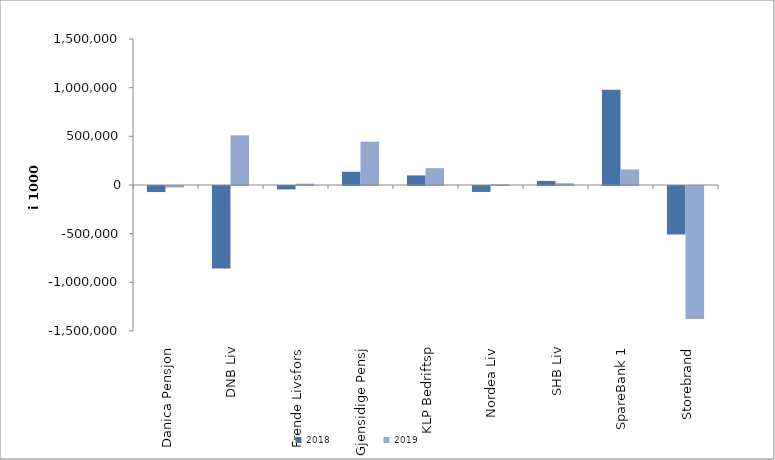
| Category | 2018 | 2019 |
|---|---|---|
| Danica Pensjon | -62184.461 | -16045.73 |
| DNB Liv | -846689 | 510695 |
| Frende Livsfors | -35262.409 | 13609.839 |
| Gjensidige Pensj | 136390 | 445335 |
| KLP Bedriftsp | 98497 | 173001 |
| Nordea Liv | -60654.123 | 7302.415 |
| SHB Liv | 41666 | 18484.602 |
| SpareBank 1 | 977355.965 | 160465.42 |
| Storebrand | -498335.653 | -1365161.726 |